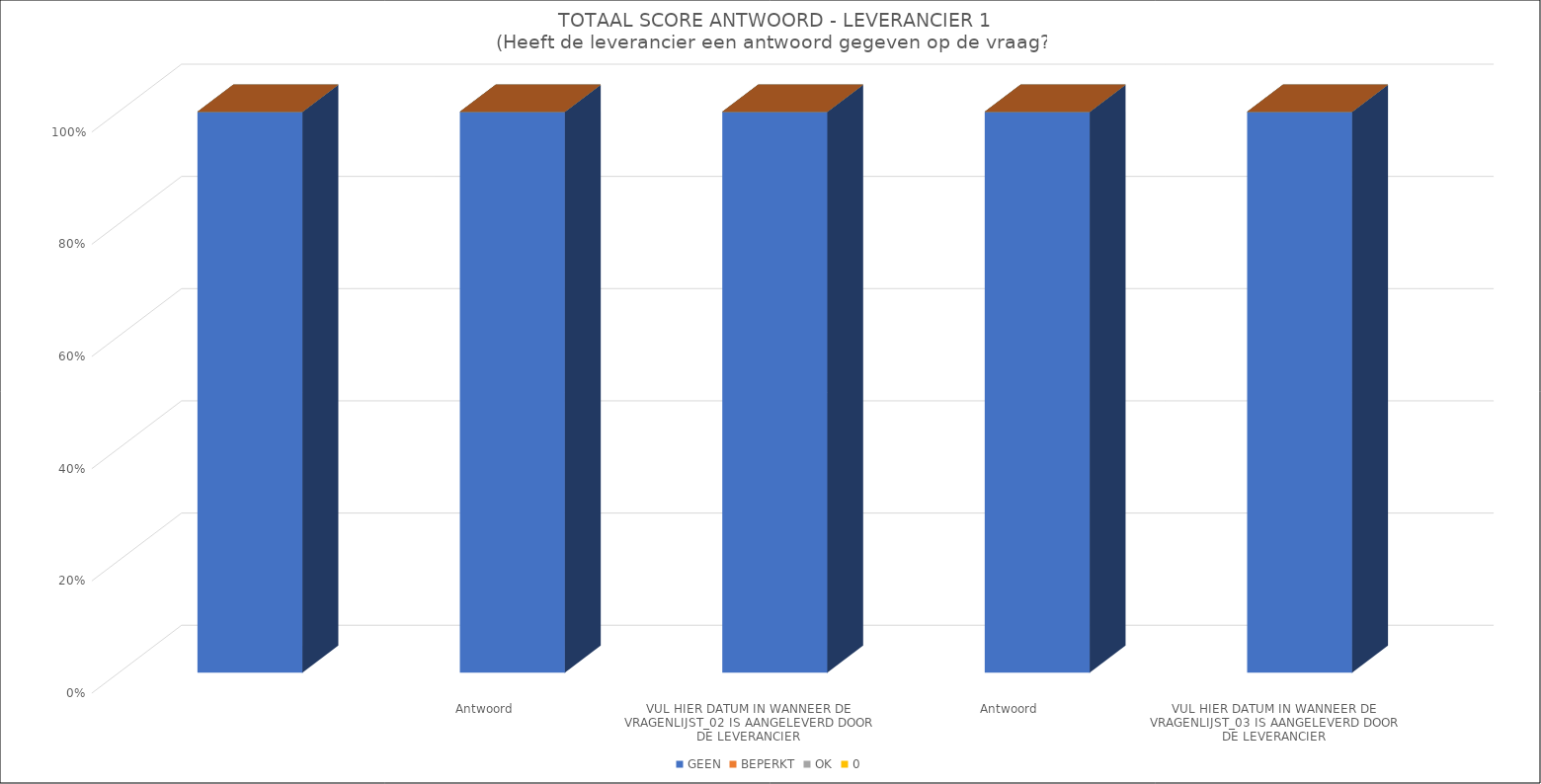
| Category | GEEN | BEPERKT | OK | 0 |
|---|---|---|---|---|
| 0 | 68 | 0 | 0 | 0 |
| 1 | 68 | 0 | 0 | 0 |
| 2 | 68 | 0 | 0 | 0 |
| 3 | 68 | 0 | 0 | 0 |
| 4 | 68 | 0 | 0 | 0 |